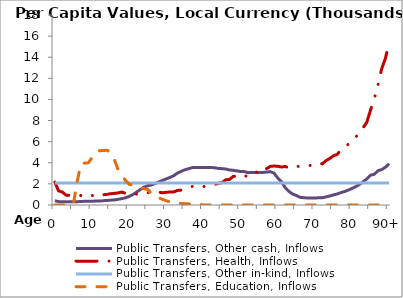
| Category | Public Transfers, Other cash, Inflows | Public Transfers, Health, Inflows | Public Transfers, Other in-kind, Inflows | Public Transfers, Education, Inflows |
|---|---|---|---|---|
| 0 | 404.894 | 2165.274 | 2078.612 | 0 |
|  | 321.525 | 1335.769 | 2078.612 | 0 |
| 2 | 312.06 | 1233.575 | 2078.612 | 0 |
| 3 | 294.55 | 935.038 | 2078.612 | 0 |
| 4 | 303.113 | 912.784 | 2078.612 | 0 |
| 5 | 309.3 | 898.556 | 2078.612 | 81.662 |
| 6 | 314.401 | 893.645 | 2078.612 | 2198.083 |
| 7 | 329.175 | 899.962 | 2078.612 | 3885.557 |
| 8 | 351.076 | 1001.129 | 2078.612 | 3970.64 |
| 9 | 345.853 | 881.041 | 2078.612 | 3992.329 |
| 10 | 352.023 | 885.618 | 2078.612 | 4482.386 |
| 11 | 374.437 | 982.195 | 2078.612 | 5002.498 |
| 12 | 372.281 | 862.455 | 2078.612 | 5148.286 |
| 13 | 407.615 | 968.396 | 2078.612 | 5153.925 |
| 14 | 428.76 | 1006.85 | 2078.612 | 5192.474 |
| 15 | 457.131 | 1068.304 | 2078.612 | 5004.959 |
| 16 | 481.358 | 1101.198 | 2078.612 | 4326.511 |
| 17 | 533.308 | 1138.735 | 2078.612 | 3374.334 |
| 18 | 603.192 | 1228.107 | 2078.612 | 2861.306 |
| 19 | 675.58 | 1113.759 | 2078.612 | 2331.013 |
| 20 | 815.885 | 1124.195 | 2078.612 | 1963.1 |
| 21 | 991.24 | 1077.813 | 2078.612 | 1874.525 |
| 22 | 1219.627 | 1023.583 | 2078.612 | 1745.444 |
| 23 | 1462.254 | 1022.226 | 2078.612 | 1638.074 |
| 24 | 1688.034 | 1119.866 | 2078.612 | 1540.575 |
| 25 | 1824.318 | 1174.046 | 2078.612 | 1477.54 |
| 26 | 1899.266 | 1141.087 | 2078.612 | 1086.354 |
| 27 | 2038.31 | 1182.636 | 2078.612 | 884.425 |
| 28 | 2181.725 | 1211.839 | 2078.612 | 681.083 |
| 29 | 2333.485 | 1163.28 | 2078.612 | 526.427 |
| 30 | 2479.685 | 1201.857 | 2078.612 | 398.98 |
| 31 | 2610.411 | 1232.337 | 2078.612 | 304.008 |
| 32 | 2776.937 | 1235.154 | 2078.612 | 235.93 |
| 33 | 3020.12 | 1380.988 | 2078.612 | 184.145 |
| 34 | 3185.148 | 1411.615 | 2078.612 | 152.406 |
| 35 | 3337.477 | 1518.105 | 2078.612 | 126.337 |
| 36 | 3432.987 | 1577.118 | 2078.612 | 105.129 |
| 37 | 3543.397 | 1754.73 | 2078.612 | 87.115 |
| 38 | 3547.577 | 1662.721 | 2078.612 | 73.646 |
| 39 | 3543.282 | 1730.674 | 2078.612 | 72.344 |
| 40 | 3550.754 | 1739.695 | 2078.612 | 0 |
| 41 | 3560.197 | 1806.696 | 2078.612 | 0 |
| 42 | 3552.007 | 1843.395 | 2078.612 | 0 |
| 43 | 3529.45 | 1937.158 | 2078.612 | 0 |
| 44 | 3468.562 | 2059.226 | 2078.612 | 0 |
| 45 | 3438.522 | 2113.677 | 2078.612 | 0 |
| 46 | 3413.554 | 2390.371 | 2078.612 | 0 |
| 47 | 3315.64 | 2417.456 | 2078.612 | 0 |
| 48 | 3295.102 | 2702.065 | 2078.612 | 0 |
| 49 | 3226.245 | 2737.595 | 2078.612 | 0 |
| 50 | 3176.612 | 2609.582 | 2078.612 | 0 |
| 51 | 3169.408 | 2760.363 | 2078.612 | 0 |
| 52 | 3064.685 | 2723.146 | 2078.612 | 0 |
| 53 | 3076.102 | 2776.62 | 2078.612 | 0 |
| 54 | 3072.354 | 2955.444 | 2078.612 | 0 |
| 55 | 3086.11 | 3417.702 | 2078.612 | 0 |
| 56 | 3086.791 | 3307.785 | 2078.612 | 0 |
| 57 | 3119.776 | 3439.782 | 2078.612 | 0 |
| 58 | 3157.717 | 3658.397 | 2078.612 | 0 |
| 59 | 3024.824 | 3689.779 | 2078.612 | 0 |
| 60 | 2559.989 | 3672.317 | 2078.612 | 0 |
| 61 | 2216.945 | 3595.913 | 2078.612 | 0 |
| 62 | 1640.194 | 3656.213 | 2078.612 | 0 |
| 63 | 1294.736 | 3495.986 | 2078.612 | 0 |
| 64 | 1039.243 | 3504.134 | 2078.612 | 0 |
| 65 | 901.339 | 3655.178 | 2078.612 | 0 |
| 66 | 724.849 | 3655.866 | 2078.612 | 0 |
| 67 | 694.632 | 3705.819 | 2078.612 | 0 |
| 68 | 665.762 | 3717.632 | 2078.612 | 0 |
| 69 | 651.893 | 3760.847 | 2078.612 | 0 |
| 70 | 660.459 | 3864.33 | 2078.612 | 0 |
| 71 | 684.168 | 3972.485 | 2078.612 | 0 |
| 72 | 692.263 | 3898.572 | 2078.612 | 0 |
| 73 | 765.857 | 4198.805 | 2078.612 | 0 |
| 74 | 848.348 | 4402.099 | 2078.612 | 0 |
| 75 | 957.53 | 4661.648 | 2078.612 | 0 |
| 76 | 1044.25 | 4782.834 | 2078.612 | 0 |
| 77 | 1170.891 | 5216.663 | 2078.612 | 0 |
| 78 | 1276.578 | 5480.657 | 2078.612 | 0 |
| 79 | 1410.708 | 5759.899 | 2078.612 | 0 |
| 80 | 1573.359 | 6104.878 | 2078.612 | 0 |
| 81 | 1736.189 | 6448.727 | 2078.612 | 0 |
| 82 | 1937.61 | 6797.509 | 2078.612 | 0 |
| 83 | 2201.126 | 7333.512 | 2078.612 | 0 |
| 84 | 2477.752 | 7840.949 | 2078.612 | 0 |
| 85 | 2829.062 | 9006.099 | 2078.612 | 0 |
| 86 | 2909.983 | 10050.05 | 2078.612 | 0 |
| 87 | 3250.587 | 11408.635 | 2078.612 | 0 |
| 88 | 3354.366 | 12913.239 | 2078.612 | 0 |
| 89 | 3578.971 | 13897.084 | 2078.612 | 0 |
| 90+ | 3914.178 | 15412.511 | 2078.612 | 0 |